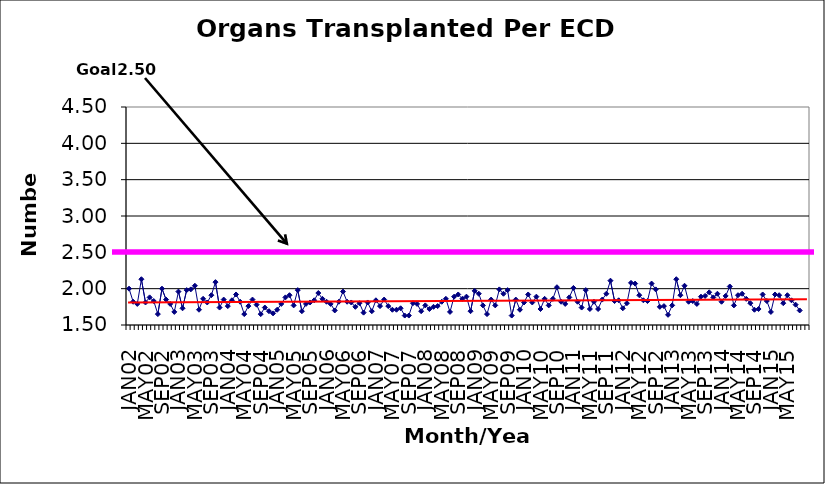
| Category | Series 0 |
|---|---|
| JAN02 | 2 |
| FEB02 | 1.82 |
| MAR02 | 1.79 |
| APR02 | 2.13 |
| MAY02 | 1.81 |
| JUN02 | 1.88 |
| JUL02 | 1.83 |
| AUG02 | 1.65 |
| SEP02 | 2 |
| OCT02 | 1.85 |
| NOV02 | 1.79 |
| DEC02 | 1.68 |
| JAN03 | 1.96 |
| FEB03 | 1.73 |
| MAR03 | 1.98 |
| APR03 | 1.99 |
| MAY03 | 2.04 |
| JUN03 | 1.71 |
| JUL03 | 1.86 |
| AUG03 | 1.81 |
| SEP03 | 1.91 |
| OCT03 | 2.09 |
| NOV03 | 1.74 |
| DEC03 | 1.85 |
| JAN04 | 1.76 |
| FEB04 | 1.84 |
| MAR04 | 1.92 |
| APR04 | 1.82 |
| MAY04 | 1.65 |
| JUN04 | 1.76 |
| JUL04 | 1.85 |
| AUG04 | 1.78 |
| SEP04 | 1.65 |
| OCT04 | 1.74 |
| NOV04 | 1.69 |
| DEC04 | 1.66 |
| JAN05 | 1.71 |
| FEB05 | 1.79 |
| MAR05 | 1.88 |
| APR05 | 1.91 |
| MAY05 | 1.77 |
| JUN05 | 1.98 |
| JUL05 | 1.69 |
| AUG05 | 1.79 |
| SEP05 | 1.81 |
| OCT05 | 1.84 |
| NOV05 | 1.94 |
| DEC05 | 1.86 |
| JAN06 | 1.82 |
| FEB06 | 1.79 |
| MAR06 | 1.7 |
| APR06 | 1.82 |
| MAY06 | 1.96 |
| JUN06 | 1.82 |
| JUL06 | 1.81 |
| AUG06 | 1.75 |
| SEP06 | 1.8 |
| OCT06 | 1.67 |
| NOV06 | 1.81 |
| DEC06 | 1.69 |
| JAN07 | 1.84 |
| FEB07 | 1.76 |
| MAR07 | 1.85 |
| APR07 | 1.76 |
| MAY07 | 1.71 |
| JUN07 | 1.71 |
| JUL07 | 1.73 |
| AUG07 | 1.63 |
| SEP07 | 1.63 |
| OCT07 | 1.8 |
| NOV07 | 1.79 |
| DEC07 | 1.69 |
| JAN08 | 1.77 |
| FEB08 | 1.72 |
| MAR08 | 1.75 |
| APR08 | 1.76 |
| MAY08 | 1.82 |
| JUN08 | 1.86 |
| JUL08 | 1.68 |
| AUG08 | 1.89 |
| SEP08 | 1.92 |
| OCT08 | 1.86 |
| NOV08 | 1.89 |
| DEC08 | 1.69 |
| JAN09 | 1.97 |
| FEB09 | 1.93 |
| MAR09 | 1.77 |
| APR09 | 1.65 |
| MAY09 | 1.85 |
| JUN09 | 1.77 |
| JUL09 | 1.99 |
| AUG09 | 1.93 |
| SEP09 | 1.98 |
| OCT09 | 1.63 |
| NOV09 | 1.85 |
| DEC09 | 1.71 |
| JAN10 | 1.81 |
| FEB10 | 1.92 |
| MAR10 | 1.81 |
| APR10 | 1.89 |
| MAY10 | 1.72 |
| JUN10 | 1.86 |
| JUL10 | 1.77 |
| AUG10 | 1.86 |
| SEP10 | 2.02 |
| OCT10 | 1.82 |
| NOV10 | 1.79 |
| DEC10 | 1.88 |
| JAN11 | 2.01 |
| FEB11 | 1.82 |
| MAR11 | 1.74 |
| APR11 | 1.98 |
| MAY11 | 1.72 |
| JUN11 | 1.82 |
| JUL11 | 1.72 |
| AUG11 | 1.85 |
| SEP11 | 1.93 |
| OCT11 | 2.11 |
| NOV11 | 1.83 |
| DEC11 | 1.84 |
| JAN12 | 1.73 |
| FEB12 | 1.8 |
| MAR12 | 2.08 |
| APR12 | 2.07 |
| MAY12 | 1.91 |
| JUN12 | 1.84 |
| JUL12 | 1.83 |
| AUG12 | 2.07 |
| SEP12 | 1.99 |
| OCT12 | 1.75 |
| NOV12 | 1.76 |
| DEC12 | 1.64 |
| JAN13 | 1.77 |
| FEB13 | 2.13 |
| MAR13 | 1.91 |
| APR13 | 2.04 |
| MAY13 | 1.82 |
| JUN13 | 1.83 |
| JUL13 | 1.79 |
| AUG13 | 1.89 |
| SEP13 | 1.9 |
| OCT13 | 1.95 |
| NOV13 | 1.88 |
| DEC13 | 1.93 |
| JAN14 | 1.82 |
| FEB14 | 1.9 |
| MAR14 | 2.03 |
| APR14 | 1.77 |
| MAY14 | 1.91 |
| JUN14 | 1.93 |
| JUL14 | 1.86 |
| AUG14 | 1.8 |
| SEP14 | 1.71 |
| OCT14 | 1.72 |
| NOV14 | 1.92 |
| DEC14 | 1.83 |
| JAN15 | 1.68 |
| FEB15 | 1.92 |
| MAR15 | 1.91 |
| APR15 | 1.8 |
| MAY15 | 1.91 |
| JUN15 | 1.84 |
| JUL15 | 1.78 |
| AUG15 | 1.7 |